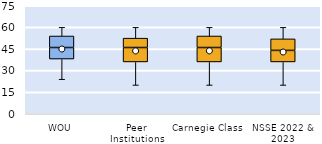
| Category | 25th | 50th | 75th |
|---|---|---|---|
| WOU | 38 | 8 | 8 |
| Peer Institutions | 36 | 10 | 6.5 |
| Carnegie Class | 36 | 10 | 8 |
| NSSE 2022 & 2023 | 36 | 8 | 8 |